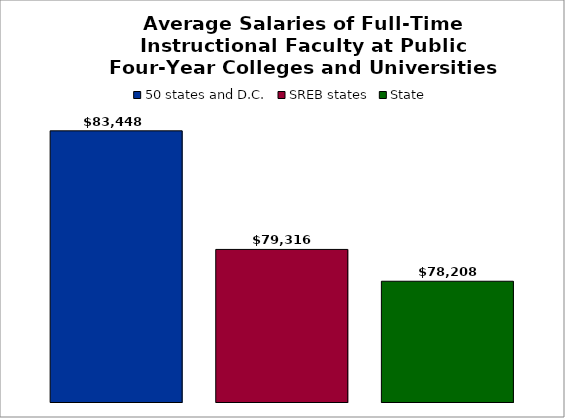
| Category | 50 states and D.C. | SREB states | State |
|---|---|---|---|
| 0 | 83448.294 | 79316.138 | 78207.84 |